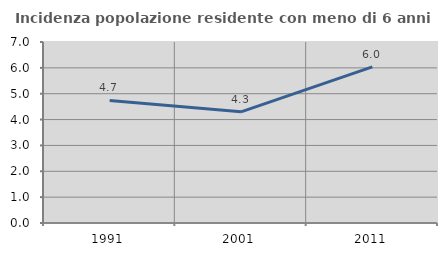
| Category | Incidenza popolazione residente con meno di 6 anni |
|---|---|
| 1991.0 | 4.742 |
| 2001.0 | 4.299 |
| 2011.0 | 6.038 |